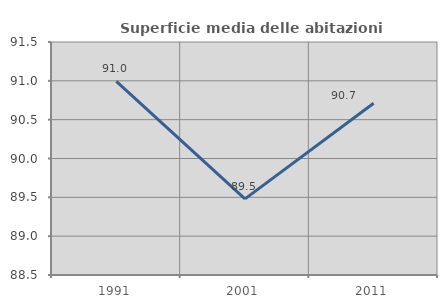
| Category | Superficie media delle abitazioni occupate |
|---|---|
| 1991.0 | 90.992 |
| 2001.0 | 89.48 |
| 2011.0 | 90.711 |